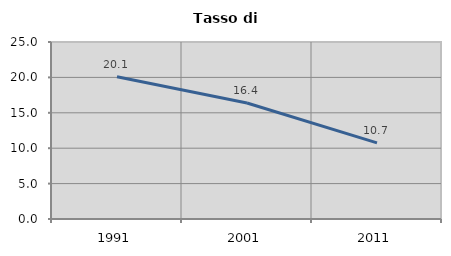
| Category | Tasso di disoccupazione   |
|---|---|
| 1991.0 | 20.103 |
| 2001.0 | 16.39 |
| 2011.0 | 10.749 |